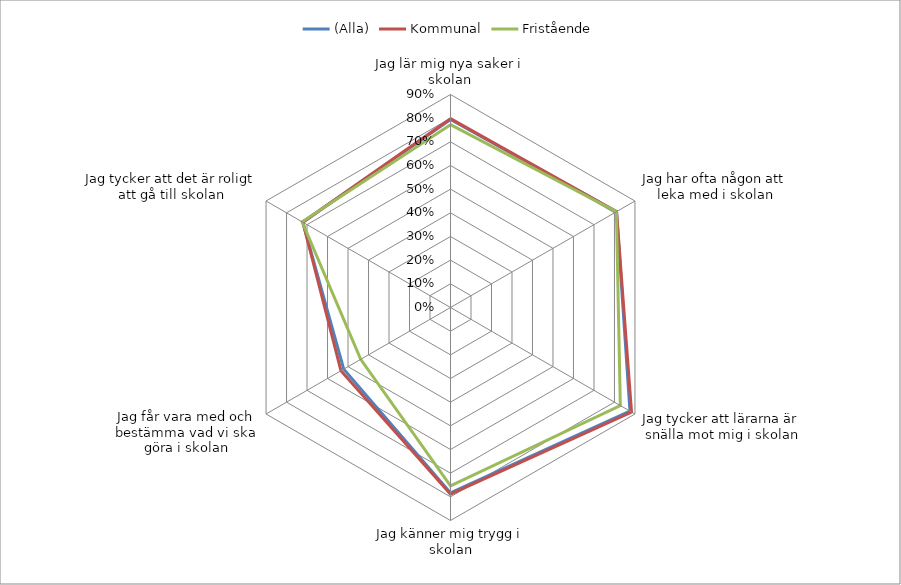
| Category | (Alla) | Kommunal | Fristående |
|---|---|---|---|
| Jag lär mig nya saker i skolan | 0.794 | 0.798 | 0.773 |
| Jag har ofta någon att leka med i skolan | 0.81 | 0.81 | 0.81 |
| Jag tycker att lärarna är snälla mot mig i skolan | 0.876 | 0.883 | 0.829 |
| Jag känner mig trygg i skolan | 0.784 | 0.788 | 0.754 |
| Jag får vara med och bestämma vad vi ska göra i skolan | 0.521 | 0.534 | 0.438 |
| Jag tycker att det är roligt att gå till skolan | 0.721 | 0.72 | 0.724 |